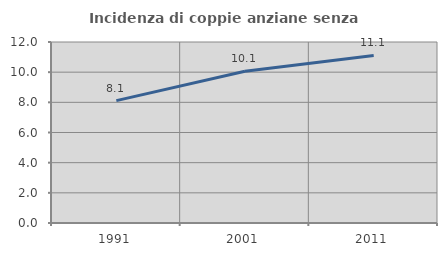
| Category | Incidenza di coppie anziane senza figli  |
|---|---|
| 1991.0 | 8.111 |
| 2001.0 | 10.058 |
| 2011.0 | 11.111 |